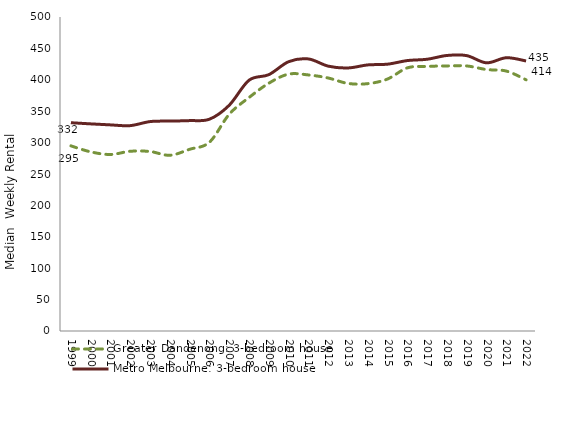
| Category | Greater Dandenong: 3-bedroom house | Metro Melbourne: 3-bedroom house |
|---|---|---|
| 1999.0 | 294.81 | 331.662 |
| 2000.0 | 285.247 | 329.817 |
| 2001.0 | 281.076 | 328.202 |
| 2002.0 | 286.158 | 327.038 |
| 2003.0 | 285.829 | 333.467 |
| 2004.0 | 279.852 | 334.268 |
| 2005.0 | 289.349 | 335.036 |
| 2006.0 | 300.603 | 337.262 |
| 2007.0 | 345.119 | 359.499 |
| 2008.0 | 371.765 | 399.303 |
| 2009.0 | 394.575 | 408.181 |
| 2010.0 | 409.019 | 428.81 |
| 2011.0 | 407.742 | 433.226 |
| 2012.0 | 402.869 | 421.753 |
| 2013.0 | 394.23 | 418.869 |
| 2014.0 | 393.881 | 423.72 |
| 2015.0 | 401.27 | 424.874 |
| 2016.0 | 419.006 | 430.645 |
| 2017.0 | 421.333 | 432.721 |
| 2018.0 | 422.074 | 438.735 |
| 2019.0 | 422.064 | 438.508 |
| 2020.0 | 416.351 | 427.027 |
| 2021.0 | 413.904 | 435.13 |
| 2022.0 | 400 | 430 |